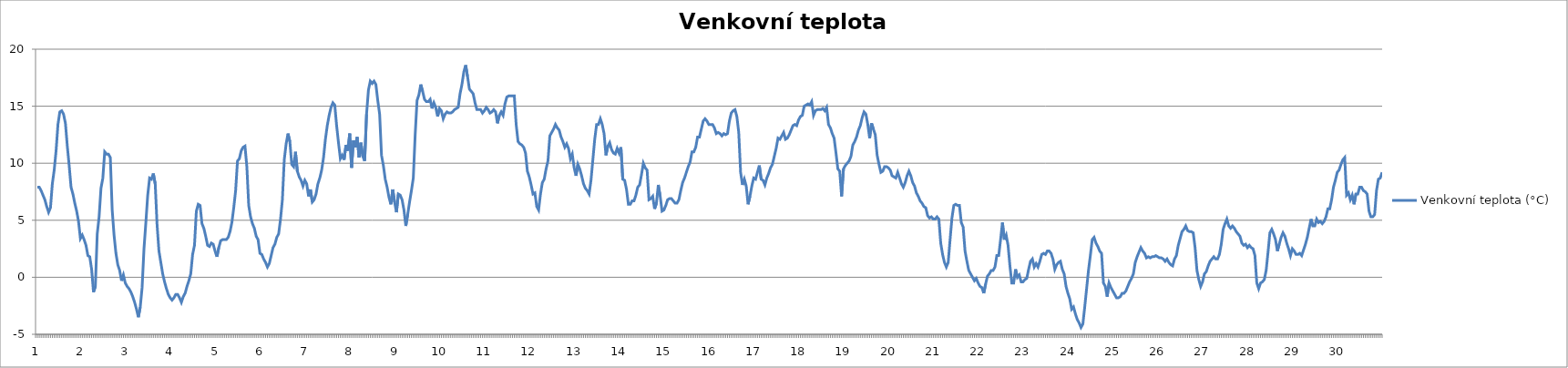
| Category | Venkovní teplota (°C) |
|---|---|
| 0 | 7.9 |
| 1 | 7.9 |
| 2 | 7.6 |
| 3 | 7.2 |
| 4 | 6.8 |
| 5 | 6.2 |
| 6 | 5.7 |
| 7 | 6.1 |
| 8 | 8.2 |
| 9 | 9.4 |
| 10 | 11.1 |
| 11 | 13.4 |
| 12 | 14.5 |
| 13 | 14.6 |
| 14 | 14.3 |
| 15 | 13.5 |
| 16 | 11.5 |
| 17 | 9.8 |
| 18 | 7.9 |
| 19 | 7.3 |
| 20 | 6.5 |
| 21 | 5.8 |
| 22 | 4.9 |
| 23 | 3.4 |
| 24 | 3.7 |
| 25 | 3.3 |
| 26 | 2.8 |
| 27 | 1.9 |
| 28 | 1.8 |
| 29 | 0.7 |
| 30 | -1.3 |
| 31 | -0.8 |
| 32 | 3.8 |
| 33 | 5.3 |
| 34 | 7.8 |
| 35 | 8.7 |
| 36 | 11 |
| 37 | 10.8 |
| 38 | 10.8 |
| 39 | 10.5 |
| 40 | 5.9 |
| 41 | 3.7 |
| 42 | 2.1 |
| 43 | 1.1 |
| 44 | 0.6 |
| 45 | -0.3 |
| 46 | 0.2 |
| 47 | -0.5 |
| 48 | -0.8 |
| 49 | -1 |
| 50 | -1.3 |
| 51 | -1.7 |
| 52 | -2.2 |
| 53 | -2.8 |
| 54 | -3.5 |
| 55 | -2.6 |
| 56 | -0.9 |
| 57 | 2.5 |
| 58 | 4.8 |
| 59 | 7.2 |
| 60 | 8.7 |
| 61 | 8.6 |
| 62 | 9.1 |
| 63 | 8.2 |
| 64 | 4.6 |
| 65 | 2.3 |
| 66 | 1.3 |
| 67 | 0.3 |
| 68 | -0.4 |
| 69 | -1 |
| 70 | -1.5 |
| 71 | -1.8 |
| 72 | -2 |
| 73 | -1.8 |
| 74 | -1.5 |
| 75 | -1.5 |
| 76 | -1.8 |
| 77 | -2.2 |
| 78 | -1.7 |
| 79 | -1.4 |
| 80 | -0.8 |
| 81 | -0.3 |
| 82 | 0.3 |
| 83 | 2 |
| 84 | 2.8 |
| 85 | 5.8 |
| 86 | 6.4 |
| 87 | 6.3 |
| 88 | 4.7 |
| 89 | 4.3 |
| 90 | 3.6 |
| 91 | 2.8 |
| 92 | 2.7 |
| 93 | 3 |
| 94 | 2.9 |
| 95 | 2.3 |
| 96 | 1.8 |
| 97 | 2.6 |
| 98 | 3.2 |
| 99 | 3.3 |
| 100 | 3.3 |
| 101 | 3.3 |
| 102 | 3.5 |
| 103 | 4 |
| 104 | 4.8 |
| 105 | 6.1 |
| 106 | 7.6 |
| 107 | 10.2 |
| 108 | 10.4 |
| 109 | 11.1 |
| 110 | 11.4 |
| 111 | 11.5 |
| 112 | 9.7 |
| 113 | 6.3 |
| 114 | 5.3 |
| 115 | 4.7 |
| 116 | 4.3 |
| 117 | 3.6 |
| 118 | 3.3 |
| 119 | 2.1 |
| 120 | 2 |
| 121 | 1.6 |
| 122 | 1.3 |
| 123 | 0.9 |
| 124 | 1.2 |
| 125 | 1.9 |
| 126 | 2.6 |
| 127 | 2.9 |
| 128 | 3.5 |
| 129 | 3.8 |
| 130 | 5.1 |
| 131 | 6.8 |
| 132 | 10.3 |
| 133 | 11.7 |
| 134 | 12.6 |
| 135 | 11.9 |
| 136 | 9.9 |
| 137 | 9.7 |
| 138 | 11 |
| 139 | 9.3 |
| 140 | 8.8 |
| 141 | 8.5 |
| 142 | 8 |
| 143 | 8.5 |
| 144 | 8.2 |
| 145 | 7.1 |
| 146 | 7.7 |
| 147 | 6.6 |
| 148 | 6.8 |
| 149 | 7.3 |
| 150 | 8.2 |
| 151 | 8.7 |
| 152 | 9.4 |
| 153 | 10.5 |
| 154 | 12.1 |
| 155 | 13.3 |
| 156 | 14.2 |
| 157 | 14.9 |
| 158 | 15.3 |
| 159 | 15.1 |
| 160 | 13.3 |
| 161 | 11.8 |
| 162 | 10.4 |
| 163 | 10.7 |
| 164 | 10.3 |
| 165 | 11.6 |
| 166 | 11.1 |
| 167 | 12.6 |
| 168 | 9.6 |
| 169 | 12 |
| 170 | 11.4 |
| 171 | 12.3 |
| 172 | 10.5 |
| 173 | 11.8 |
| 174 | 10.6 |
| 175 | 10.2 |
| 176 | 14.3 |
| 177 | 16.4 |
| 178 | 17.2 |
| 179 | 17 |
| 180 | 17.2 |
| 181 | 16.9 |
| 182 | 15.5 |
| 183 | 14.3 |
| 184 | 10.7 |
| 185 | 9.8 |
| 186 | 8.6 |
| 187 | 7.9 |
| 188 | 7 |
| 189 | 6.4 |
| 190 | 7.7 |
| 191 | 6.6 |
| 192 | 5.7 |
| 193 | 7.3 |
| 194 | 7.2 |
| 195 | 6.8 |
| 196 | 5.9 |
| 197 | 4.5 |
| 198 | 5.5 |
| 199 | 6.6 |
| 200 | 7.6 |
| 201 | 8.7 |
| 202 | 12.5 |
| 203 | 15.5 |
| 204 | 16 |
| 205 | 16.9 |
| 206 | 16.3 |
| 207 | 15.6 |
| 208 | 15.4 |
| 209 | 15.4 |
| 210 | 15.6 |
| 211 | 14.8 |
| 212 | 15.3 |
| 213 | 14.9 |
| 214 | 14.1 |
| 215 | 14.8 |
| 216 | 14.6 |
| 217 | 13.9 |
| 218 | 14.3 |
| 219 | 14.5 |
| 220 | 14.4 |
| 221 | 14.4 |
| 222 | 14.5 |
| 223 | 14.7 |
| 224 | 14.8 |
| 225 | 14.9 |
| 226 | 16.1 |
| 227 | 16.9 |
| 228 | 18 |
| 229 | 18.6 |
| 230 | 17.6 |
| 231 | 16.5 |
| 232 | 16.3 |
| 233 | 16.1 |
| 234 | 15.3 |
| 235 | 14.7 |
| 236 | 14.7 |
| 237 | 14.7 |
| 238 | 14.4 |
| 239 | 14.6 |
| 240 | 14.9 |
| 241 | 14.7 |
| 242 | 14.4 |
| 243 | 14.5 |
| 244 | 14.7 |
| 245 | 14.5 |
| 246 | 13.5 |
| 247 | 14.2 |
| 248 | 14.5 |
| 249 | 14.2 |
| 250 | 15.2 |
| 251 | 15.8 |
| 252 | 15.9 |
| 253 | 15.9 |
| 254 | 15.9 |
| 255 | 15.9 |
| 256 | 13.4 |
| 257 | 11.9 |
| 258 | 11.7 |
| 259 | 11.6 |
| 260 | 11.4 |
| 261 | 10.9 |
| 262 | 9.3 |
| 263 | 8.8 |
| 264 | 8.1 |
| 265 | 7.3 |
| 266 | 7.4 |
| 267 | 6.2 |
| 268 | 5.9 |
| 269 | 7.3 |
| 270 | 8.3 |
| 271 | 8.6 |
| 272 | 9.5 |
| 273 | 10.2 |
| 274 | 12.4 |
| 275 | 12.7 |
| 276 | 13 |
| 277 | 13.4 |
| 278 | 13.1 |
| 279 | 12.9 |
| 280 | 12.3 |
| 281 | 11.9 |
| 282 | 11.4 |
| 283 | 11.7 |
| 284 | 11.3 |
| 285 | 10.4 |
| 286 | 10.8 |
| 287 | 9.6 |
| 288 | 8.9 |
| 289 | 9.9 |
| 290 | 9.5 |
| 291 | 8.9 |
| 292 | 8.2 |
| 293 | 7.8 |
| 294 | 7.6 |
| 295 | 7.3 |
| 296 | 8.5 |
| 297 | 10.3 |
| 298 | 12.1 |
| 299 | 13.4 |
| 300 | 13.4 |
| 301 | 13.9 |
| 302 | 13.4 |
| 303 | 12.6 |
| 304 | 10.7 |
| 305 | 11.5 |
| 306 | 11.8 |
| 307 | 11.2 |
| 308 | 10.9 |
| 309 | 10.8 |
| 310 | 11.3 |
| 311 | 10.9 |
| 312 | 11.4 |
| 313 | 8.6 |
| 314 | 8.5 |
| 315 | 7.7 |
| 316 | 6.4 |
| 317 | 6.4 |
| 318 | 6.7 |
| 319 | 6.7 |
| 320 | 7.2 |
| 321 | 7.9 |
| 322 | 8.1 |
| 323 | 9 |
| 324 | 10 |
| 325 | 9.6 |
| 326 | 9.4 |
| 327 | 6.8 |
| 328 | 6.9 |
| 329 | 7.1 |
| 330 | 6 |
| 331 | 6.5 |
| 332 | 8.1 |
| 333 | 7.1 |
| 334 | 5.8 |
| 335 | 5.9 |
| 336 | 6.3 |
| 337 | 6.8 |
| 338 | 6.9 |
| 339 | 6.9 |
| 340 | 6.7 |
| 341 | 6.5 |
| 342 | 6.5 |
| 343 | 6.8 |
| 344 | 7.6 |
| 345 | 8.3 |
| 346 | 8.7 |
| 347 | 9.2 |
| 348 | 9.7 |
| 349 | 10.1 |
| 350 | 11 |
| 351 | 11 |
| 352 | 11.4 |
| 353 | 12.3 |
| 354 | 12.3 |
| 355 | 13 |
| 356 | 13.7 |
| 357 | 13.9 |
| 358 | 13.7 |
| 359 | 13.4 |
| 360 | 13.4 |
| 361 | 13.4 |
| 362 | 13.1 |
| 363 | 12.6 |
| 364 | 12.7 |
| 365 | 12.6 |
| 366 | 12.4 |
| 367 | 12.6 |
| 368 | 12.5 |
| 369 | 12.6 |
| 370 | 13.7 |
| 371 | 14.4 |
| 372 | 14.6 |
| 373 | 14.7 |
| 374 | 14.1 |
| 375 | 12.7 |
| 376 | 9.2 |
| 377 | 8.1 |
| 378 | 8.6 |
| 379 | 8 |
| 380 | 6.4 |
| 381 | 7.1 |
| 382 | 8 |
| 383 | 8.7 |
| 384 | 8.6 |
| 385 | 9.2 |
| 386 | 9.8 |
| 387 | 8.6 |
| 388 | 8.5 |
| 389 | 8.1 |
| 390 | 8.7 |
| 391 | 9.1 |
| 392 | 9.6 |
| 393 | 9.9 |
| 394 | 10.6 |
| 395 | 11.3 |
| 396 | 12.2 |
| 397 | 12.1 |
| 398 | 12.4 |
| 399 | 12.7 |
| 400 | 12.1 |
| 401 | 12.2 |
| 402 | 12.5 |
| 403 | 12.9 |
| 404 | 13.3 |
| 405 | 13.4 |
| 406 | 13.3 |
| 407 | 13.8 |
| 408 | 14.1 |
| 409 | 14.2 |
| 410 | 15 |
| 411 | 15.1 |
| 412 | 15.2 |
| 413 | 15.1 |
| 414 | 15.4 |
| 415 | 14.2 |
| 416 | 14.6 |
| 417 | 14.7 |
| 418 | 14.7 |
| 419 | 14.7 |
| 420 | 14.8 |
| 421 | 14.6 |
| 422 | 14.9 |
| 423 | 13.4 |
| 424 | 13.1 |
| 425 | 12.6 |
| 426 | 12.2 |
| 427 | 10.9 |
| 428 | 9.5 |
| 429 | 9.3 |
| 430 | 7.1 |
| 431 | 9.5 |
| 432 | 9.8 |
| 433 | 10 |
| 434 | 10.2 |
| 435 | 10.6 |
| 436 | 11.6 |
| 437 | 11.9 |
| 438 | 12.3 |
| 439 | 12.9 |
| 440 | 13.3 |
| 441 | 14 |
| 442 | 14.5 |
| 443 | 14.3 |
| 444 | 13.4 |
| 445 | 12.2 |
| 446 | 13.5 |
| 447 | 13 |
| 448 | 12.5 |
| 449 | 10.7 |
| 450 | 9.9 |
| 451 | 9.2 |
| 452 | 9.3 |
| 453 | 9.7 |
| 454 | 9.7 |
| 455 | 9.6 |
| 456 | 9.4 |
| 457 | 8.9 |
| 458 | 8.8 |
| 459 | 8.7 |
| 460 | 9.2 |
| 461 | 8.7 |
| 462 | 8.2 |
| 463 | 7.9 |
| 464 | 8.3 |
| 465 | 8.9 |
| 466 | 9.3 |
| 467 | 8.9 |
| 468 | 8.3 |
| 469 | 8 |
| 470 | 7.4 |
| 471 | 7.1 |
| 472 | 6.7 |
| 473 | 6.5 |
| 474 | 6.2 |
| 475 | 6.1 |
| 476 | 5.4 |
| 477 | 5.2 |
| 478 | 5.3 |
| 479 | 5.1 |
| 480 | 5.1 |
| 481 | 5.3 |
| 482 | 5.1 |
| 483 | 3 |
| 484 | 2 |
| 485 | 1.3 |
| 486 | 0.9 |
| 487 | 1.3 |
| 488 | 3.3 |
| 489 | 5.2 |
| 490 | 6.3 |
| 491 | 6.4 |
| 492 | 6.3 |
| 493 | 6.3 |
| 494 | 4.8 |
| 495 | 4.4 |
| 496 | 2.3 |
| 497 | 1.4 |
| 498 | 0.6 |
| 499 | 0.3 |
| 500 | 0 |
| 501 | -0.3 |
| 502 | -0.1 |
| 503 | -0.5 |
| 504 | -0.8 |
| 505 | -0.9 |
| 506 | -1.4 |
| 507 | -0.6 |
| 508 | 0.1 |
| 509 | 0.3 |
| 510 | 0.6 |
| 511 | 0.6 |
| 512 | 0.9 |
| 513 | 1.9 |
| 514 | 1.9 |
| 515 | 3.3 |
| 516 | 4.8 |
| 517 | 3.3 |
| 518 | 3.7 |
| 519 | 2.8 |
| 520 | 1 |
| 521 | -0.5 |
| 522 | -0.5 |
| 523 | 0.7 |
| 524 | 0 |
| 525 | 0.2 |
| 526 | -0.4 |
| 527 | -0.4 |
| 528 | -0.2 |
| 529 | -0.1 |
| 530 | 0.7 |
| 531 | 1.4 |
| 532 | 1.6 |
| 533 | 0.9 |
| 534 | 1.2 |
| 535 | 0.9 |
| 536 | 1.4 |
| 537 | 2 |
| 538 | 2.1 |
| 539 | 2 |
| 540 | 2.3 |
| 541 | 2.3 |
| 542 | 2.1 |
| 543 | 1.6 |
| 544 | 0.7 |
| 545 | 1.1 |
| 546 | 1.3 |
| 547 | 1.4 |
| 548 | 0.7 |
| 549 | 0.3 |
| 550 | -0.8 |
| 551 | -1.4 |
| 552 | -1.9 |
| 553 | -2.8 |
| 554 | -2.6 |
| 555 | -3.2 |
| 556 | -3.7 |
| 557 | -4 |
| 558 | -4.4 |
| 559 | -4.1 |
| 560 | -2.6 |
| 561 | -1 |
| 562 | 0.6 |
| 563 | 1.9 |
| 564 | 3.3 |
| 565 | 3.5 |
| 566 | 3 |
| 567 | 2.7 |
| 568 | 2.3 |
| 569 | 2.1 |
| 570 | -0.5 |
| 571 | -0.8 |
| 572 | -1.7 |
| 573 | -0.5 |
| 574 | -0.9 |
| 575 | -1.2 |
| 576 | -1.5 |
| 577 | -1.8 |
| 578 | -1.8 |
| 579 | -1.7 |
| 580 | -1.4 |
| 581 | -1.4 |
| 582 | -1.2 |
| 583 | -0.8 |
| 584 | -0.4 |
| 585 | -0.1 |
| 586 | 0.3 |
| 587 | 1.3 |
| 588 | 1.8 |
| 589 | 2.2 |
| 590 | 2.6 |
| 591 | 2.3 |
| 592 | 2.1 |
| 593 | 1.7 |
| 594 | 1.8 |
| 595 | 1.7 |
| 596 | 1.8 |
| 597 | 1.8 |
| 598 | 1.9 |
| 599 | 1.8 |
| 600 | 1.7 |
| 601 | 1.7 |
| 602 | 1.6 |
| 603 | 1.4 |
| 604 | 1.6 |
| 605 | 1.3 |
| 606 | 1.1 |
| 607 | 1 |
| 608 | 1.6 |
| 609 | 1.9 |
| 610 | 2.8 |
| 611 | 3.4 |
| 612 | 4 |
| 613 | 4.2 |
| 614 | 4.5 |
| 615 | 4.1 |
| 616 | 4 |
| 617 | 4 |
| 618 | 3.9 |
| 619 | 2.6 |
| 620 | 0.6 |
| 621 | -0.2 |
| 622 | -0.8 |
| 623 | -0.4 |
| 624 | 0.3 |
| 625 | 0.5 |
| 626 | 1 |
| 627 | 1.4 |
| 628 | 1.6 |
| 629 | 1.8 |
| 630 | 1.6 |
| 631 | 1.6 |
| 632 | 2 |
| 633 | 2.9 |
| 634 | 4.2 |
| 635 | 4.7 |
| 636 | 5.1 |
| 637 | 4.5 |
| 638 | 4.3 |
| 639 | 4.5 |
| 640 | 4.3 |
| 641 | 4 |
| 642 | 3.8 |
| 643 | 3.6 |
| 644 | 3 |
| 645 | 2.8 |
| 646 | 2.9 |
| 647 | 2.6 |
| 648 | 2.8 |
| 649 | 2.6 |
| 650 | 2.5 |
| 651 | 1.9 |
| 652 | -0.5 |
| 653 | -1 |
| 654 | -0.5 |
| 655 | -0.4 |
| 656 | -0.2 |
| 657 | 0.6 |
| 658 | 2.2 |
| 659 | 3.9 |
| 660 | 4.2 |
| 661 | 3.8 |
| 662 | 3.3 |
| 663 | 2.3 |
| 664 | 2.9 |
| 665 | 3.5 |
| 666 | 3.9 |
| 667 | 3.6 |
| 668 | 3 |
| 669 | 2.5 |
| 670 | 1.9 |
| 671 | 2.5 |
| 672 | 2.3 |
| 673 | 2 |
| 674 | 2 |
| 675 | 2.1 |
| 676 | 1.9 |
| 677 | 2.4 |
| 678 | 2.9 |
| 679 | 3.5 |
| 680 | 4.3 |
| 681 | 5.1 |
| 682 | 4.5 |
| 683 | 4.5 |
| 684 | 5.1 |
| 685 | 4.8 |
| 686 | 4.9 |
| 687 | 4.7 |
| 688 | 4.9 |
| 689 | 5.3 |
| 690 | 6 |
| 691 | 6 |
| 692 | 6.8 |
| 693 | 7.9 |
| 694 | 8.5 |
| 695 | 9.2 |
| 696 | 9.4 |
| 697 | 9.9 |
| 698 | 10.3 |
| 699 | 10.5 |
| 700 | 7.2 |
| 701 | 7.4 |
| 702 | 6.8 |
| 703 | 7.2 |
| 704 | 6.4 |
| 705 | 7.3 |
| 706 | 7.3 |
| 707 | 7.9 |
| 708 | 7.9 |
| 709 | 7.6 |
| 710 | 7.5 |
| 711 | 7.3 |
| 712 | 5.8 |
| 713 | 5.3 |
| 714 | 5.3 |
| 715 | 5.5 |
| 716 | 7.6 |
| 717 | 8.6 |
| 718 | 8.7 |
| 719 | 9.2 |